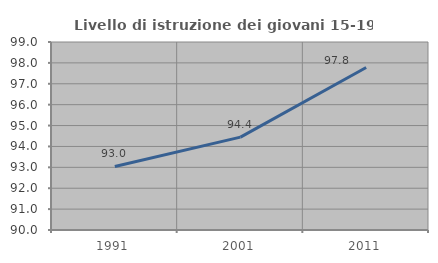
| Category | Livello di istruzione dei giovani 15-19 anni |
|---|---|
| 1991.0 | 93.043 |
| 2001.0 | 94.444 |
| 2011.0 | 97.778 |